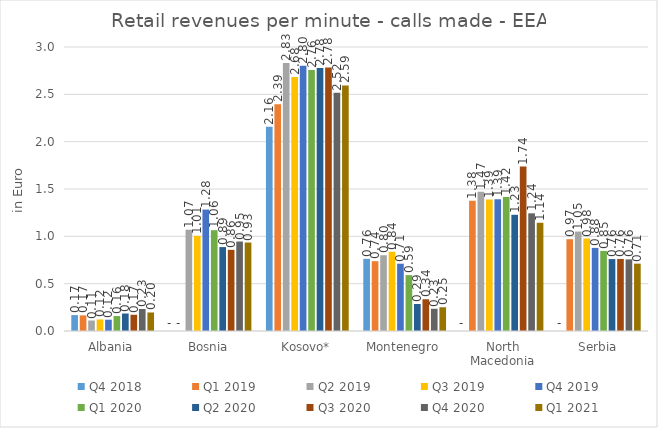
| Category | Q4 2018 | Q1 2019 | Q2 2019 | Q3 2019 | Q4 2019 | Q1 2020 | Q2 2020 | Q3 2020 | Q4 2020 | Q1 2021 |
|---|---|---|---|---|---|---|---|---|---|---|
| Albania | 0.168 | 0.165 | 0.111 | 0.122 | 0.119 | 0.158 | 0.185 | 0.171 | 0.232 | 0.196 |
| Bosnia | 0 | 0 | 1.07 | 1.006 | 1.283 | 1.065 | 0.887 | 0.857 | 0.945 | 0.935 |
| Kosovo* | 2.156 | 2.395 | 2.83 | 2.683 | 2.803 | 2.757 | 2.779 | 2.784 | 2.517 | 2.595 |
| Montenegro | 0.762 | 0.737 | 0.8 | 0.838 | 0.711 | 0.59 | 0.285 | 0.335 | 0.235 | 0.251 |
| North Macedonia | 0 | 1.377 | 1.47 | 1.389 | 1.392 | 1.416 | 1.228 | 1.737 | 1.243 | 1.143 |
| Serbia | 0 | 0.97 | 1.05 | 0.977 | 0.878 | 0.846 | 0.76 | 0.761 | 0.757 | 0.711 |